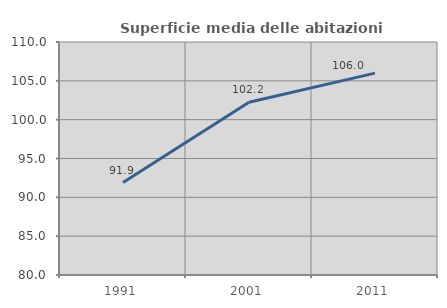
| Category | Superficie media delle abitazioni occupate |
|---|---|
| 1991.0 | 91.901 |
| 2001.0 | 102.243 |
| 2011.0 | 105.994 |